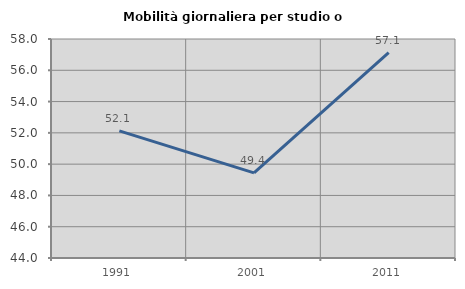
| Category | Mobilità giornaliera per studio o lavoro |
|---|---|
| 1991.0 | 52.128 |
| 2001.0 | 49.443 |
| 2011.0 | 57.13 |